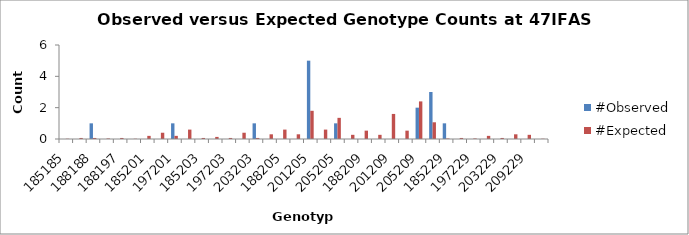
| Category | #Observed | #Expected |
|---|---|---|
| 185185.0 | 0 | 0.017 |
| 185188.0 | 0 | 0.067 |
| 188188.0 | 1 | 0.067 |
| 185197.0 | 0 | 0.033 |
| 188197.0 | 0 | 0.067 |
| 197197.0 | 0 | 0.017 |
| 185201.0 | 0 | 0.2 |
| 188201.0 | 0 | 0.4 |
| 197201.0 | 1 | 0.2 |
| 201201.0 | 0 | 0.6 |
| 185203.0 | 0 | 0.067 |
| 188203.0 | 0 | 0.133 |
| 197203.0 | 0 | 0.067 |
| 201203.0 | 0 | 0.4 |
| 203203.0 | 1 | 0.067 |
| 185205.0 | 0 | 0.3 |
| 188205.0 | 0 | 0.6 |
| 197205.0 | 0 | 0.3 |
| 201205.0 | 5 | 1.8 |
| 203205.0 | 0 | 0.6 |
| 205205.0 | 1 | 1.35 |
| 185209.0 | 0 | 0.267 |
| 188209.0 | 0 | 0.533 |
| 197209.0 | 0 | 0.267 |
| 201209.0 | 0 | 1.6 |
| 203209.0 | 0 | 0.533 |
| 205209.0 | 2 | 2.4 |
| 209209.0 | 3 | 1.067 |
| 185229.0 | 1 | 0.033 |
| 188229.0 | 0 | 0.067 |
| 197229.0 | 0 | 0.033 |
| 201229.0 | 0 | 0.2 |
| 203229.0 | 0 | 0.067 |
| 205229.0 | 0 | 0.3 |
| 209229.0 | 0 | 0.267 |
| 229229.0 | 0 | 0.017 |